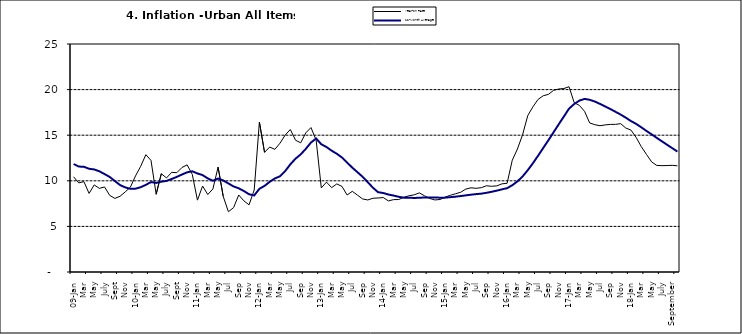
| Category | Year-on Rate | 12-Month Average |
|---|---|---|
| 09-Jan | 10.439 | 11.844 |
| Feb | 9.772 | 11.562 |
| Mar | 9.907 | 11.538 |
| Apr | 8.618 | 11.319 |
| May | 9.547 | 11.246 |
| June | 9.17 | 11.039 |
| July | 9.325 | 10.738 |
| Aug | 8.401 | 10.424 |
| Sept | 8.07 | 9.973 |
| Oct | 8.3 | 9.535 |
| Nov | 8.781 | 9.278 |
| Dec | 9.298 | 9.117 |
| 10-Jan | 10.534 | 9.136 |
| Feb | 11.584 | 9.297 |
| Mar | 12.864 | 9.555 |
| Apr | 12.24 | 9.859 |
| May | 8.524 | 9.769 |
| June | 10.781 | 9.904 |
| July | 10.313 | 9.987 |
| Aug | 10.924 | 10.197 |
| Sept | 10.891 | 10.43 |
| Oct | 11.457 | 10.689 |
| Nov | 11.748 | 10.932 |
| Dec | 10.699 | 11.042 |
| 11-Jan | 7.878 | 10.806 |
| Feb | 9.426 | 10.623 |
| Mar | 8.498 | 10.26 |
| Apr | 9.11 | 10.005 |
| May | 11.5 | 10.249 |
| Jun | 8.278 | 10.034 |
| Jul | 6.608 | 9.711 |
| Aug | 7.061 | 9.38 |
| Sep | 8.443 | 9.178 |
| Oct | 7.802 | 8.88 |
| Nov | 7.365 | 8.525 |
| Dec | 8.993 | 8.395 |
| 12-Jan | 16.445 | 9.119 |
| Feb | 13.123 | 9.443 |
| Mar | 13.701 | 9.889 |
| Apr | 13.447 | 10.259 |
| May | 14.127 | 10.496 |
| Jun | 15.012 | 11.062 |
| Jul | 15.63 | 11.81 |
| Aug | 14.456 | 12.422 |
| Sep | 14.162 | 12.893 |
| Oct | 15.26 | 13.506 |
| Nov | 15.836 | 14.199 |
| Dec | 14.459 | 14.637 |
| 13-Jan | 9.22 | 14.006 |
| Feb | 9.85 | 13.703 |
| Mar | 9.253 | 13.302 |
| Apr | 9.657 | 12.966 |
| May | 9.385 | 12.557 |
| Jun | 8.441 | 11.999 |
| Jul | 8.849 | 11.443 |
| Aug | 8.431 | 10.946 |
| Sep | 8.013 | 10.44 |
| Oct | 7.9 | 9.849 |
| Nov | 8.086 | 9.245 |
| Dec | 8.117 | 8.75 |
| 14-Jan | 8.164 | 8.662 |
| Feb | 7.791 | 8.493 |
| Mar | 7.937 | 8.384 |
| Apr | 7.947 | 8.246 |
| May | 8.195 | 8.151 |
| Jun | 8.358 | 8.146 |
| Jul | 8.464 | 8.118 |
| Aug | 8.673 | 8.141 |
| Sep | 8.357 | 8.17 |
| Oct | 8.064 | 8.182 |
| Nov | 7.902 | 8.165 |
| Dec | 7.948 | 8.151 |
| 15-Jan | 8.211 | 8.155 |
| Feb | 8.412 | 8.206 |
| Mar | 8.579 | 8.26 |
| Apr | 8.742 | 8.326 |
| May | 9.092 | 8.403 |
| Jun | 9.232 | 8.478 |
| Jul | 9.177 | 8.54 |
| Aug | 9.25 | 8.591 |
| Sep | 9.455 | 8.684 |
| Oct | 9.398 | 8.795 |
| Nov | 9.442 | 8.922 |
| Dec | 9.665 | 9.064 |
| 16-Jan | 9.728 | 9.19 |
| Feb | 12.254 | 9.516 |
| Mar | 13.485 | 9.935 |
| Apr | 15.052 | 10.474 |
| May | 17.148 | 11.165 |
| Jun | 18.111 | 11.925 |
| Jul | 18.927 | 12.754 |
| Aug | 19.325 | 13.605 |
| Sep | 19.476 | 14.444 |
| Oct | 19.914 | 15.318 |
| Nov | 20.067 | 16.193 |
| Dec | 20.118 | 17.05 |
| 17-Jan | 20.315 | 17.914 |
| Feb | 18.569 | 18.418 |
| Mar | 18.27 | 18.794 |
| Apr | 17.621 | 18.982 |
| May | 16.343 | 18.883 |
| Jun | 16.153 | 18.692 |
| Jul | 16.038 | 18.43 |
| Aug | 16.128 | 18.151 |
| Sep | 16.183 | 17.872 |
| Oct | 16.187 | 17.567 |
| Nov | 16.267 | 17.264 |
| Dec | 15.785 | 16.921 |
| 18-Jan | 15.559 | 16.55 |
| Feb | 14.763 | 16.241 |
| Mar | 13.748 | 15.866 |
| Apr | 12.893 | 15.468 |
| May | 12.077 | 15.096 |
| June | 11.683 | 14.706 |
| July | 11.661 | 14.329 |
| August | 11.673 | 13.951 |
| September | 11.697 | 13.578 |
| October | 11.64 | 13.206 |